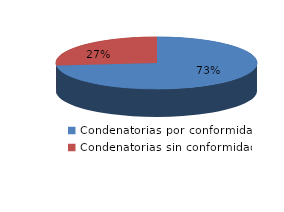
| Category | Series 0 |
|---|---|
| 0 | 520 |
| 1 | 188 |